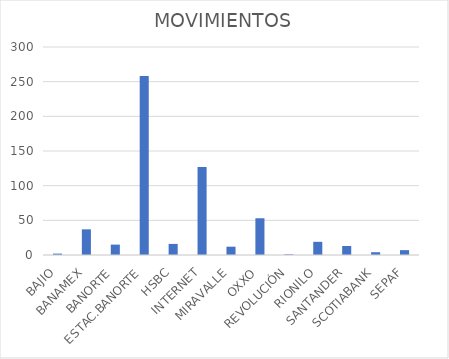
| Category | MOVIMIENTOS |
|---|---|
| BAJIO | 2 |
| BANAMEX | 37 |
| BANORTE | 15 |
| ESTAC.BANORTE | 258 |
| HSBC | 16 |
| INTERNET | 127 |
| MIRAVALLE | 12 |
| OXXO | 53 |
| REVOLUCIÓN | 1 |
| RIONILO | 19 |
| SANTANDER | 13 |
| SCOTIABANK | 4 |
| SEPAF | 7 |